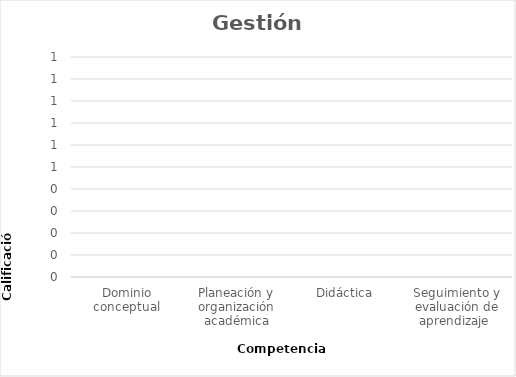
| Category | Series 0 |
|---|---|
| Dominio conceptual | 0 |
| Planeación y organización académica | 0 |
| Didáctica | 0 |
| Seguimiento y evaluación de aprendizaje  | 0 |